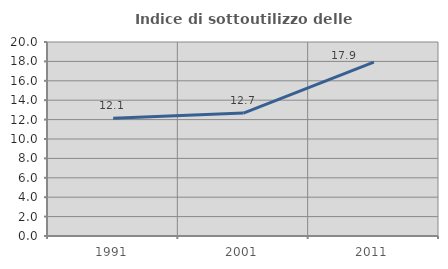
| Category | Indice di sottoutilizzo delle abitazioni  |
|---|---|
| 1991.0 | 12.138 |
| 2001.0 | 12.676 |
| 2011.0 | 17.933 |